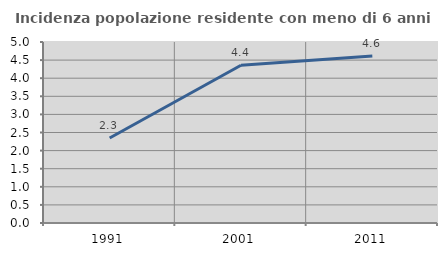
| Category | Incidenza popolazione residente con meno di 6 anni |
|---|---|
| 1991.0 | 2.347 |
| 2001.0 | 4.357 |
| 2011.0 | 4.615 |